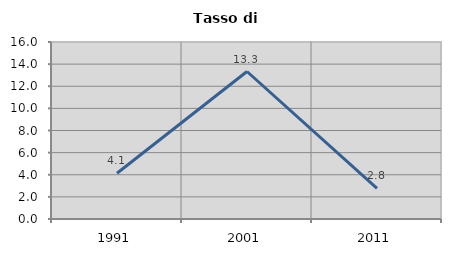
| Category | Tasso di disoccupazione   |
|---|---|
| 1991.0 | 4.138 |
| 2001.0 | 13.333 |
| 2011.0 | 2.778 |